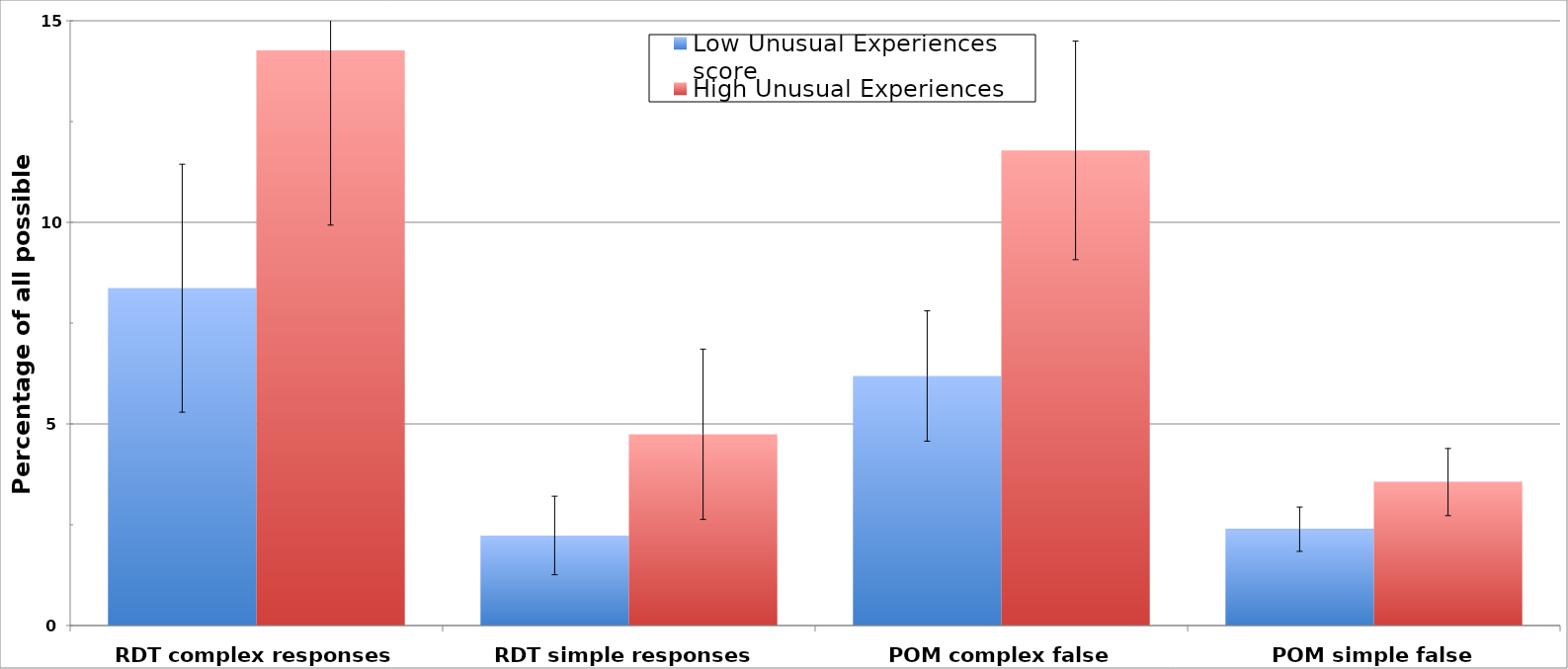
| Category | Low Unusual Experiences score | High Unusual Experiences score |
|---|---|---|
| RDT complex responses | 8.367 | 14.263 |
| RDT simple responses | 2.233 | 4.744 |
| POM complex false alarms | 6.189 | 11.784 |
| POM simple false alarms | 2.389 | 3.558 |